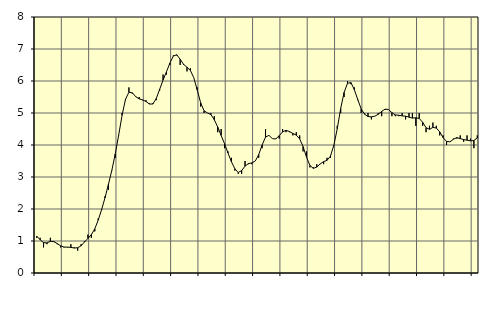
| Category | Piggar | Series 1 |
|---|---|---|
| nan | 1.1 | 1.15 |
| 87.0 | 1.1 | 1.04 |
| 87.0 | 0.8 | 0.95 |
| 87.0 | 0.9 | 0.94 |
| nan | 1.1 | 0.99 |
| 88.0 | 1 | 0.98 |
| 88.0 | 0.9 | 0.92 |
| 88.0 | 0.8 | 0.85 |
| nan | 0.8 | 0.81 |
| 89.0 | 0.8 | 0.81 |
| 89.0 | 0.9 | 0.8 |
| 89.0 | 0.8 | 0.78 |
| nan | 0.7 | 0.79 |
| 90.0 | 0.9 | 0.85 |
| 90.0 | 1 | 0.97 |
| 90.0 | 1.2 | 1.08 |
| nan | 1.1 | 1.2 |
| 91.0 | 1.3 | 1.38 |
| 91.0 | 1.7 | 1.65 |
| 91.0 | 2 | 1.98 |
| nan | 2.4 | 2.35 |
| 92.0 | 2.6 | 2.77 |
| 92.0 | 3.2 | 3.21 |
| 92.0 | 3.6 | 3.72 |
| nan | 4.3 | 4.31 |
| 93.0 | 5 | 4.93 |
| 93.0 | 5.4 | 5.43 |
| 93.0 | 5.8 | 5.65 |
| nan | 5.6 | 5.63 |
| 94.0 | 5.5 | 5.51 |
| 94.0 | 5.5 | 5.44 |
| 94.0 | 5.4 | 5.41 |
| nan | 5.4 | 5.36 |
| 95.0 | 5.3 | 5.28 |
| 95.0 | 5.3 | 5.28 |
| 95.0 | 5.4 | 5.45 |
| nan | 5.7 | 5.74 |
| 96.0 | 6.2 | 6.03 |
| 96.0 | 6.2 | 6.29 |
| 96.0 | 6.5 | 6.56 |
| nan | 6.8 | 6.78 |
| 97.0 | 6.8 | 6.82 |
| 97.0 | 6.5 | 6.68 |
| 97.0 | 6.5 | 6.52 |
| nan | 6.3 | 6.43 |
| 98.0 | 6.4 | 6.33 |
| 98.0 | 6.1 | 6.1 |
| 98.0 | 5.8 | 5.72 |
| nan | 5.2 | 5.32 |
| 99.0 | 5 | 5.07 |
| 99.0 | 5 | 5 |
| 99.0 | 5 | 4.95 |
| nan | 4.9 | 4.79 |
| 0.0 | 4.4 | 4.56 |
| 0.0 | 4.5 | 4.3 |
| 0.0 | 3.9 | 4.04 |
| nan | 3.8 | 3.75 |
| 1.0 | 3.6 | 3.48 |
| 1.0 | 3.2 | 3.26 |
| 1.0 | 3.1 | 3.14 |
| nan | 3.1 | 3.2 |
| 2.0 | 3.5 | 3.34 |
| 2.0 | 3.4 | 3.42 |
| 2.0 | 3.4 | 3.44 |
| nan | 3.5 | 3.5 |
| 3.0 | 3.6 | 3.7 |
| 3.0 | 3.9 | 4 |
| 3.0 | 4.5 | 4.25 |
| nan | 4.3 | 4.3 |
| 4.0 | 4.2 | 4.2 |
| 4.0 | 4.2 | 4.19 |
| 4.0 | 4.2 | 4.29 |
| nan | 4.5 | 4.41 |
| 5.0 | 4.4 | 4.46 |
| 5.0 | 4.4 | 4.42 |
| 5.0 | 4.3 | 4.36 |
| nan | 4.4 | 4.31 |
| 6.0 | 4.3 | 4.19 |
| 6.0 | 3.8 | 3.95 |
| 6.0 | 3.8 | 3.62 |
| nan | 3.3 | 3.36 |
| 7.0 | 3.3 | 3.27 |
| 7.0 | 3.4 | 3.31 |
| 7.0 | 3.4 | 3.41 |
| nan | 3.4 | 3.48 |
| 8.0 | 3.6 | 3.52 |
| 8.0 | 3.6 | 3.65 |
| 8.0 | 4 | 3.99 |
| nan | 4.6 | 4.51 |
| 9.0 | 5 | 5.14 |
| 9.0 | 5.5 | 5.64 |
| 9.0 | 6 | 5.93 |
| nan | 5.9 | 5.95 |
| 10.0 | 5.8 | 5.73 |
| 10.0 | 5.4 | 5.42 |
| 10.0 | 5 | 5.13 |
| nan | 5 | 4.96 |
| 11.0 | 5 | 4.89 |
| 11.0 | 4.8 | 4.88 |
| 11.0 | 4.9 | 4.9 |
| nan | 5 | 4.96 |
| 12.0 | 4.9 | 5.05 |
| 12.0 | 5.1 | 5.12 |
| 12.0 | 5.1 | 5.11 |
| nan | 4.9 | 5.01 |
| 13.0 | 4.9 | 4.94 |
| 13.0 | 4.9 | 4.93 |
| 13.0 | 5 | 4.91 |
| nan | 4.8 | 4.9 |
| 14.0 | 5 | 4.87 |
| 14.0 | 5 | 4.84 |
| 14.0 | 4.6 | 4.85 |
| nan | 5 | 4.83 |
| 15.0 | 4.6 | 4.71 |
| 15.0 | 4.4 | 4.54 |
| 15.0 | 4.6 | 4.49 |
| nan | 4.7 | 4.55 |
| 16.0 | 4.6 | 4.53 |
| 16.0 | 4.3 | 4.41 |
| 16.0 | 4.3 | 4.23 |
| nan | 4 | 4.11 |
| 17.0 | 4.1 | 4.1 |
| 17.0 | 4.2 | 4.18 |
| 17.0 | 4.2 | 4.23 |
| nan | 4.3 | 4.2 |
| 18.0 | 4.1 | 4.17 |
| 18.0 | 4.3 | 4.15 |
| 18.0 | 4.2 | 4.13 |
| nan | 3.9 | 4.14 |
| 19.0 | 4.3 | 4.22 |